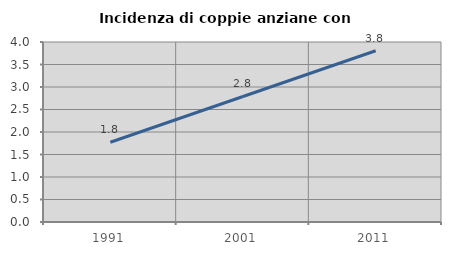
| Category | Incidenza di coppie anziane con figli |
|---|---|
| 1991.0 | 1.772 |
| 2001.0 | 2.789 |
| 2011.0 | 3.806 |